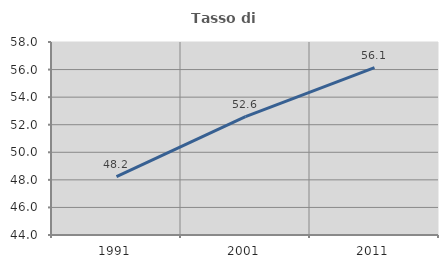
| Category | Tasso di occupazione   |
|---|---|
| 1991.0 | 48.234 |
| 2001.0 | 52.583 |
| 2011.0 | 56.145 |